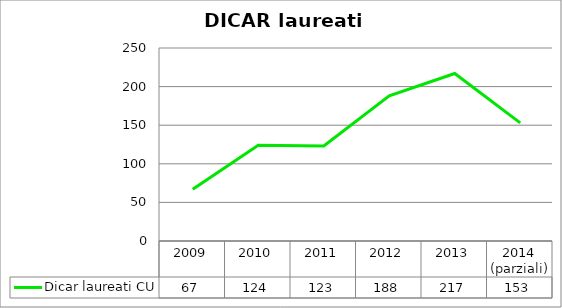
| Category | Dicar laureati CU |
|---|---|
| 2009 | 67 |
| 2010 | 124 |
| 2011 | 123 |
| 2012 | 188 |
| 2013 | 217 |
| 2014
(parziali) | 153 |